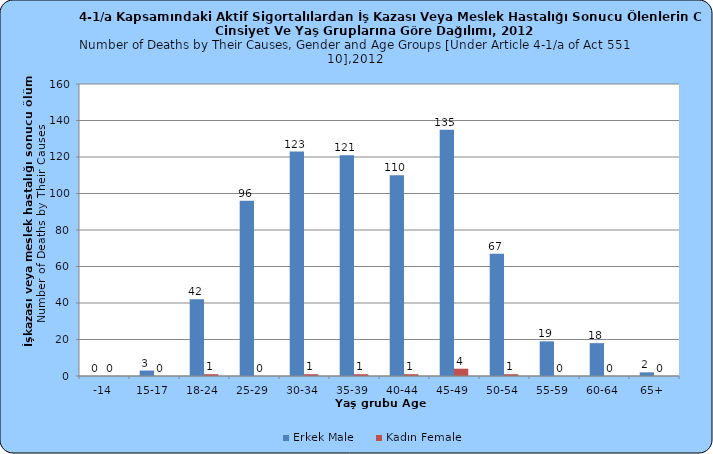
| Category | Erkek Male | Kadın Female |
|---|---|---|
| -14 | 0 | 0 |
| 15-17 | 3 | 0 |
| 18-24 | 42 | 1 |
| 25-29 | 96 | 0 |
| 30-34 | 123 | 1 |
| 35-39 | 121 | 1 |
| 40-44 | 110 | 1 |
| 45-49 | 135 | 4 |
| 50-54 | 67 | 1 |
| 55-59 | 19 | 0 |
| 60-64 | 18 | 0 |
| 65+ | 2 | 0 |